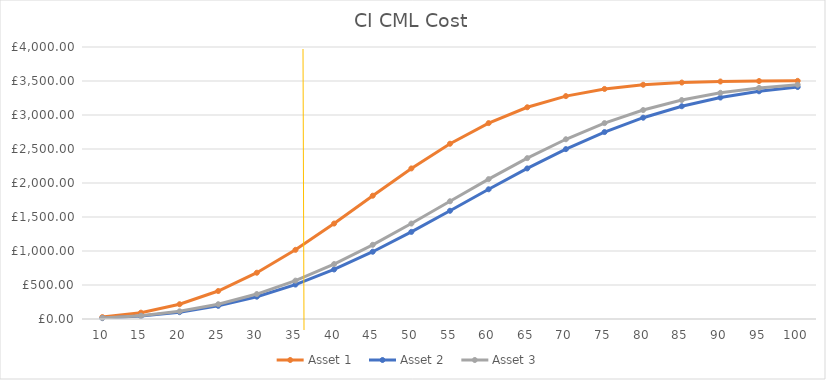
| Category | Asset 1 | Asset 2 | Asset 3 |
|---|---|---|---|
| 10.0 | 27.913 | 12.733 | 14.319 |
| 15.0 | 93.317 | 42.787 | 48.093 |
| 20.0 | 217.171 | 100.574 | 112.927 |
| 25.0 | 411.618 | 193.744 | 217.171 |
| 30.0 | 680.517 | 328.016 | 366.755 |
| 35.0 | 1017.15 | 506.348 | 564.2 |
| 40.0 | 1403.684 | 728.22 | 807.801 |
| 45.0 | 1813.206 | 989.192 | 1091.217 |
| 50.0 | 2214.345 | 1280.914 | 1403.684 |
| 55.0 | 2577.493 | 1591.7 | 1730.952 |
| 60.0 | 2880.764 | 1907.674 | 2056.905 |
| 65.0 | 3113.728 | 2214.345 | 2365.616 |
| 70.0 | 3277.753 | 2498.376 | 2643.449 |
| 75.0 | 3383.175 | 2749.186 | 2880.764 |
| 80.0 | 3444.755 | 2960.087 | 3072.849 |
| 85.0 | 3477.294 | 3128.706 | 3219.905 |
| 90.0 | 3492.771 | 3256.667 | 3326.175 |
| 95.0 | 3499.364 | 3348.665 | 3398.502 |
| 100.0 | 3501.867 | 3411.202 | 3444.755 |